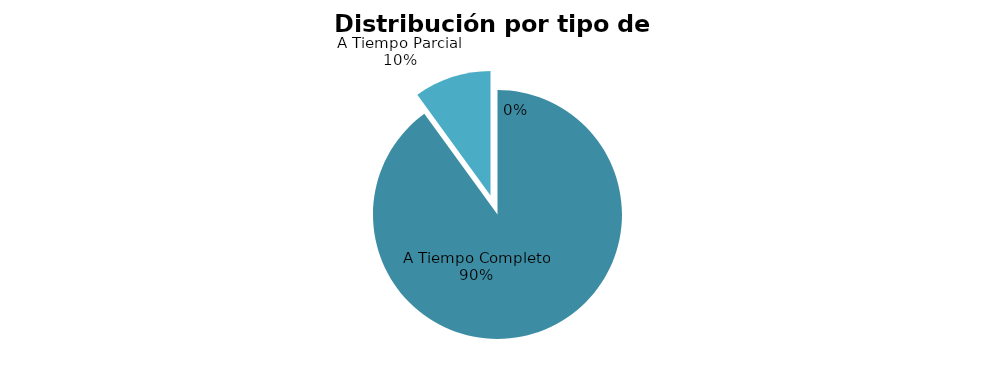
| Category | 9 |
|---|---|
| A Tiempo Completo | 9 |
| A Tiempo Parcial | 1 |